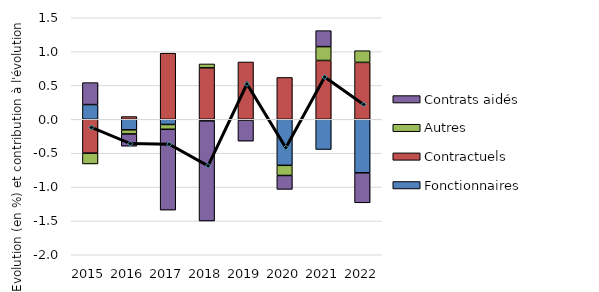
| Category | Fonctionnaires | Contractuels | Autres | Contrats aidés |
|---|---|---|---|---|
| 2015.0 | 0.218 | -0.5 | -0.159 | 0.324 |
| 2016.0 | -0.155 | 0.041 | -0.062 | -0.179 |
| 2017.0 | -0.076 | 0.977 | -0.071 | -1.193 |
| 2018.0 | -0.022 | 0.761 | 0.057 | -1.479 |
| 2019.0 | -0.002 | 0.847 | -0.009 | -0.31 |
| 2020.0 | -0.679 | 0.619 | -0.15 | -0.205 |
| 2021.0 | -0.445 | 0.869 | 0.205 | 0.236 |
| 2022.0 | -0.79 | 0.841 | 0.173 | -0.442 |